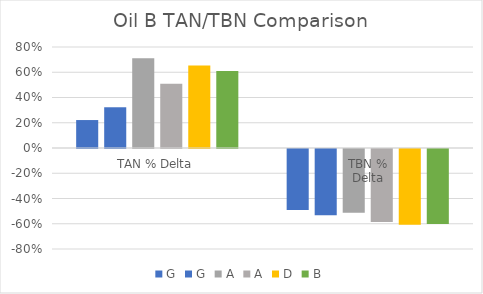
| Category | G | A | D | B |
|---|---|---|---|---|
| TAN % Delta | 0.323 | 0.509 | 0.654 | 0.61 |
| TBN %
Delta | -0.524 | -0.577 | -0.6 | -0.593 |